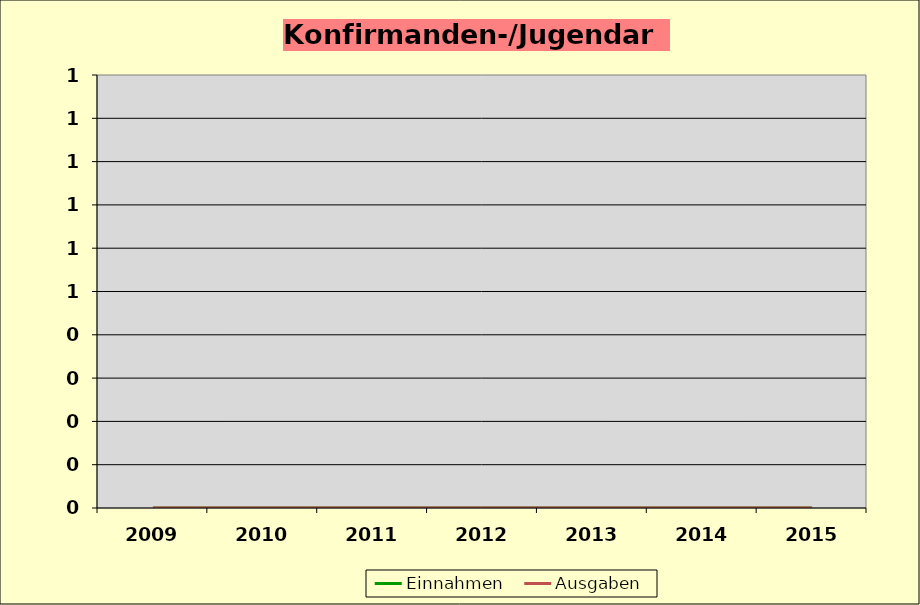
| Category | Einnahmen | Ausgaben |
|---|---|---|
| 2009.0 | 0 | 0 |
| 2010.0 | 0 | 0 |
| 2011.0 | 0 | 0 |
| 2012.0 | 0 | 0 |
| 2013.0 | 0 | 0 |
| 2014.0 | 0 | 0 |
| 2015.0 | 0 | 0 |